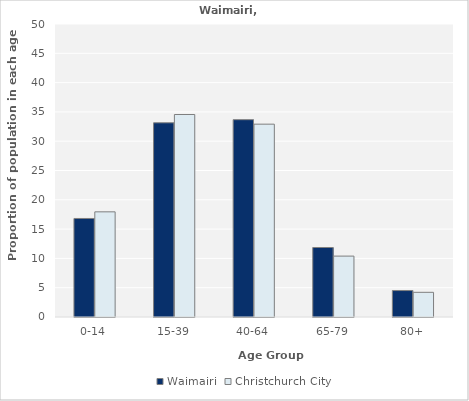
| Category | Waimairi | Christchurch City |
|---|---|---|
| 0-14 | 16.814 | 17.945 |
| 15-39 | 33.142 | 34.556 |
| 40-64 | 33.673 | 32.907 |
| 65-79 | 11.858 | 10.392 |
| 80+ | 4.513 | 4.211 |